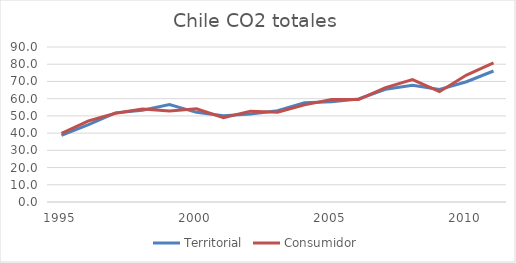
| Category | Territorial | Consumidor |
|---|---|---|
| 1995.0 | 38.649 | 39.865 |
| 1996.0 | 44.919 | 47.134 |
| 1997.0 | 51.756 | 51.545 |
| 1998.0 | 53.224 | 53.929 |
| 1999.0 | 56.624 | 52.773 |
| 2000.0 | 52.074 | 54.149 |
| 2001.0 | 50.097 | 48.941 |
| 2002.0 | 51.146 | 52.756 |
| 2003.0 | 53.011 | 52.159 |
| 2004.0 | 57.699 | 56.407 |
| 2005.0 | 58.143 | 59.481 |
| 2006.0 | 59.856 | 59.479 |
| 2007.0 | 65.426 | 66.415 |
| 2008.0 | 67.807 | 71.119 |
| 2009.0 | 65.294 | 64.058 |
| 2010.0 | 69.843 | 73.688 |
| 2011.0 | 76.061 | 80.796 |